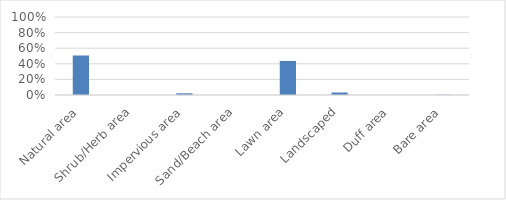
| Category | Series 0 |
|---|---|
| Natural area | 0.507 |
| Shrub/Herb area | 0 |
| Impervious area | 0.022 |
| Sand/Beach area | 0 |
| Lawn area | 0.437 |
| Landscaped | 0.032 |
| Duff area | 0 |
| Bare area | 0.003 |